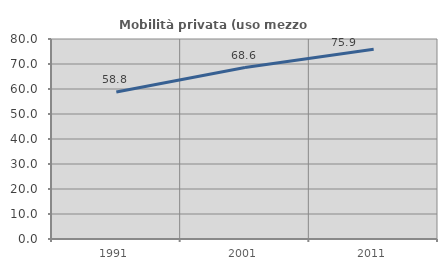
| Category | Mobilità privata (uso mezzo privato) |
|---|---|
| 1991.0 | 58.829 |
| 2001.0 | 68.566 |
| 2011.0 | 75.862 |